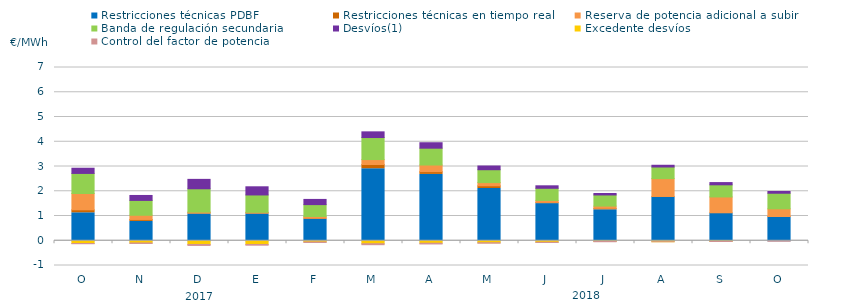
| Category | Restricciones técnicas PDBF | Restricciones técnicas en tiempo real | Reserva de potencia adicional a subir | Banda de regulación secundaria | Desvíos(1) | Excedente desvíos | Control del factor de potencia |
|---|---|---|---|---|---|---|---|
| O | 1.13 | 0.12 | 0.66 | 0.81 | 0.21 | -0.11 | -0.05 |
| N | 0.78 | 0.08 | 0.17 | 0.6 | 0.2 | -0.09 | -0.06 |
| D | 1.08 | 0.05 | 0.03 | 0.94 | 0.38 | -0.15 | -0.08 |
| E | 1.08 | 0.05 | 0.02 | 0.7 | 0.33 | -0.15 | -0.07 |
| F | 0.87 | 0.05 | 0.06 | 0.48 | 0.21 | -0.05 | -0.06 |
| M | 2.91 | 0.17 | 0.2 | 0.89 | 0.23 | -0.12 | -0.08 |
| A | 2.68 | 0.11 | 0.27 | 0.68 | 0.22 | -0.1 | -0.07 |
| M | 2.11 | 0.11 | 0.13 | 0.52 | 0.15 | -0.08 | -0.06 |
| J | 1.5 | 0.05 | 0.08 | 0.49 | 0.1 | -0.06 | -0.05 |
| J | 1.25 | 0.06 | 0.09 | 0.45 | 0.06 | -0.03 | -0.05 |
| A | 1.75 | 0.04 | 0.72 | 0.47 | 0.07 | -0.04 | -0.04 |
| S | 1.11 | 0.02 | 0.64 | 0.49 | 0.09 | -0.03 | -0.04 |
| O | 0.94 | 0.04 | 0.31 | 0.63 | 0.07 | 0 | -0.06 |